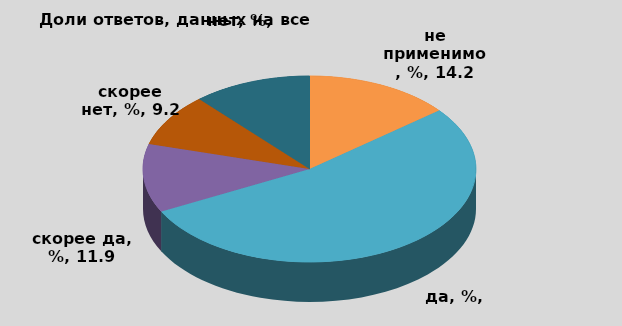
| Category | B |
|---|---|
| не применимо, % | 14.176 |
| да, % | 53.257 |
| скорее да, % | 11.877 |
| скорее нет, % | 9.195 |
| нет, % | 11.494 |